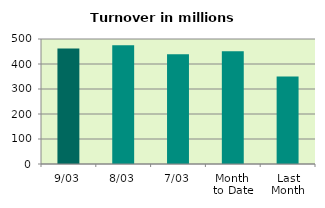
| Category | Series 0 |
|---|---|
| 9/03 | 461.818 |
| 8/03 | 475.236 |
| 7/03 | 438.591 |
| Month 
to Date | 451.35 |
| Last
Month | 349.641 |